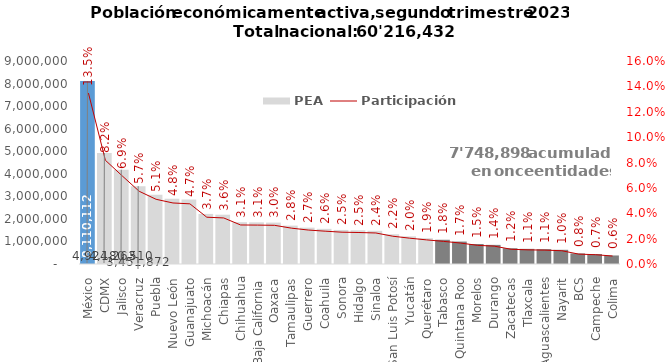
| Category | PEA |
|---|---|
| México | 8110112 |
| CDMX | 4924263 |
| Jalisco | 4180510 |
| Veracruz | 3451872 |
| Puebla | 3070602 |
| Nuevo León | 2896509 |
| Guanajuato | 2855201 |
| Michoacán | 2220568 |
| Chiapas | 2186029 |
| Chihuahua | 1852357 |
| Baja California | 1846385 |
| Oaxaca | 1836475 |
| Tamaulipas | 1702013 |
| Guerrero | 1611640 |
| Coahuila | 1558041 |
| Sonora | 1509288 |
| Hidalgo | 1494828 |
| Sinaloa | 1472153 |
| San Luis Potosí | 1318723 |
| Yucatán | 1225510 |
| Querétaro | 1144455 |
| Tabasco | 1074438 |
| Quintana Roo | 994829 |
| Morelos | 886686 |
| Durango | 847630 |
| Zacatecas | 698767 |
| Tlaxcala | 670784 |
| Aguascalientes | 658669 |
| Nayarit | 628886 |
| BCS | 468916 |
| Campeche | 440693 |
| Colima | 378600 |